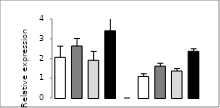
| Category | Series 0 |
|---|---|
|  - | 2.058 |
| HC | 2.634 |